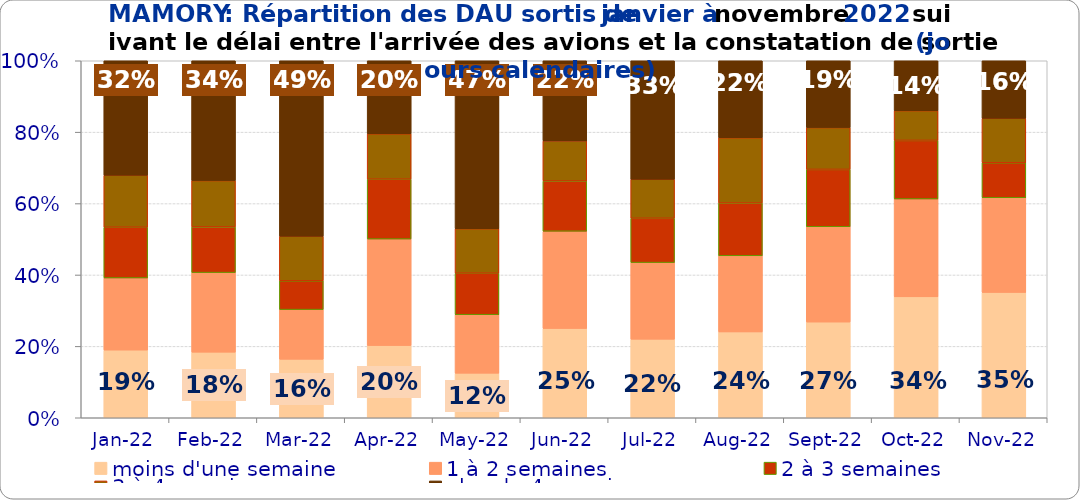
| Category | moins d'une semaine | 1 à 2 semaines | 2 à 3 semaines | 3 à 4 semaines | plus de 4 semaines |
|---|---|---|---|---|---|
| 2022-01-01 | 0.189 | 0.202 | 0.142 | 0.146 | 0.321 |
| 2022-02-01 | 0.184 | 0.223 | 0.128 | 0.13 | 0.336 |
| 2022-03-01 | 0.164 | 0.139 | 0.081 | 0.125 | 0.491 |
| 2022-04-01 | 0.202 | 0.298 | 0.168 | 0.127 | 0.205 |
| 2022-05-01 | 0.125 | 0.164 | 0.116 | 0.125 | 0.47 |
| 2022-06-01 | 0.25 | 0.272 | 0.141 | 0.112 | 0.224 |
| 2022-07-01 | 0.22 | 0.215 | 0.124 | 0.109 | 0.332 |
| 2022-08-01 | 0.24 | 0.213 | 0.148 | 0.183 | 0.216 |
| 2022-09-01 | 0.268 | 0.267 | 0.161 | 0.117 | 0.187 |
| 2022-10-01 | 0.339 | 0.274 | 0.164 | 0.083 | 0.14 |
| 2022-11-01 | 0.351 | 0.265 | 0.098 | 0.125 | 0.161 |